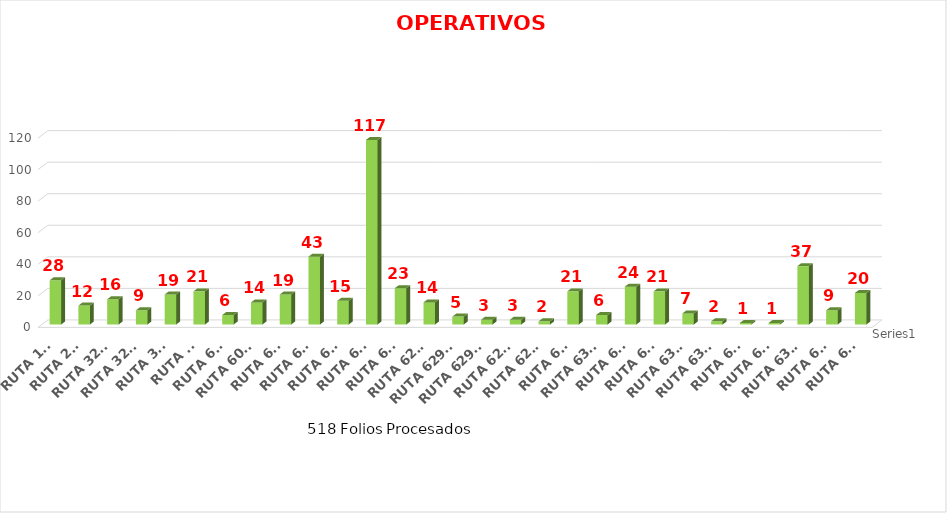
| Category | Series 0 |
|---|---|
| RUTA 171 | 28 |
| RUTA 24A | 12 |
| RUTA 320  | 16 |
| RUTA 320A | 9 |
| RUTA 321 | 19 |
| RUTA 55 | 21 |
| RUTA 602 | 6 |
| RUTA 603B | 14 |
| RUTA 614 | 19 |
| RUTA 615 | 43 |
| RUTA 616 | 15 |
| RUTA 619 | 117 |
| RUTA 626 | 23 |
| RUTA 629   | 14 |
| RUTA 629 1 | 5 |
| RUTA 629 2 | 3 |
| RUTA 629A | 3 |
| RUTA 629B | 2 |
| RUTA 631 | 21 |
| RUTA 631A | 6 |
| RUTA 632 | 24 |
| RUTA 632 | 21 |
| RUTA 632A | 7 |
| RUTA 632A | 2 |
| RUTA 633 | 1 |
| RUTA 634 | 1 |
| RUTA 636A | 37 |
| RUTA 637 | 9 |
| RUTA 641 | 20 |